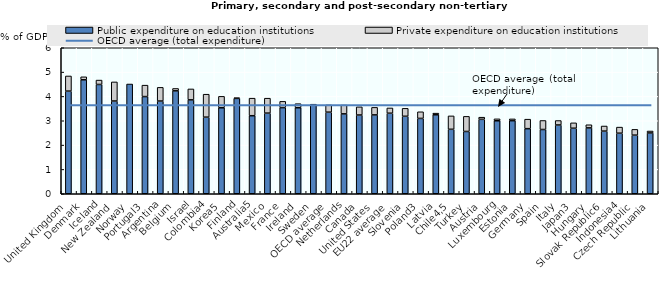
| Category | Public expenditure on education institutions | Private expenditure on education institutions |
|---|---|---|
| United Kingdom | 4.218 | 0.622 |
| Denmark | 4.684 | 0.123 |
| Iceland | 4.491 | 0.181 |
| New Zealand | 3.811 | 0.785 |
| Norway | 4.51 | 0 |
| Portugal3 | 3.993 | 0.47 |
| Argentina | 3.81 | 0.562 |
| Belgium | 4.229 | 0.098 |
| Israel | 3.859 | 0.449 |
| Colombia4 | 3.148 | 0.943 |
| Korea5 | 3.533 | 0.47 |
| Finland | 3.919 | 0.025 |
| Australia5 | 3.207 | 0.721 |
| Mexico | 3.314 | 0.614 |
| France | 3.54 | 0.258 |
| Ireland | 3.534 | 0.168 |
| Sweden | 3.68 | 0 |
| OECD average | 3.353 | 0.297 |
| Netherlands | 3.284 | 0.362 |
| Canada | 3.236 | 0.335 |
| United States | 3.241 | 0.309 |
| EU22 average | 3.31 | 0.217 |
| Slovenia | 3.184 | 0.327 |
| Poland3 | 3.096 | 0.273 |
| Latvia | 3.245 | 0.067 |
| Chile4,5 | 2.649 | 0.551 |
| Turkey | 2.56 | 0.621 |
| Austria | 3.059 | 0.088 |
| Luxembourg | 3 | 0.079 |
| Estonia | 3.004 | 0.072 |
| Germany | 2.675 | 0.39 |
| Spain | 2.641 | 0.37 |
| Italy | 2.826 | 0.183 |
| Japan3 | 2.693 | 0.221 |
| Hungary | 2.707 | 0.129 |
| Slovak Republic6 | 2.575 | 0.21 |
| Indonesia4 | 2.489 | 0.25 |
| Czech Republic | 2.409 | 0.237 |
| Lithuania | 2.5 | 0.079 |